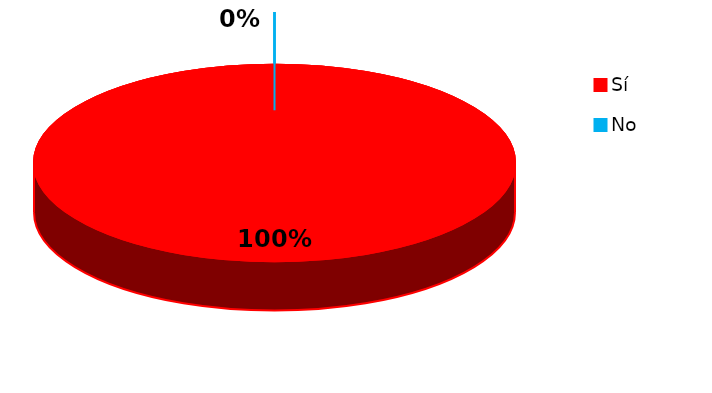
| Category | Series 0 |
|---|---|
| 0 | 36 |
| 1 | 0 |